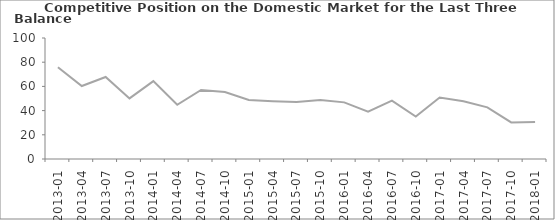
| Category | Balance |
|---|---|
| 2013-01 | 75.9 |
| 2013-04 | 60.3 |
| 2013-07 | 67.8 |
| 2013-10 | 50.1 |
| 2014-01 | 64.4 |
| 2014-04 | 44.8 |
| 2014-07 | 57.1 |
| 2014-10 | 55.4 |
| 2015-01 | 48.8 |
| 2015-04 | 47.8 |
| 2015-07 | 47.1 |
| 2015-10 | 48.8 |
| 2016-01 | 46.8 |
| 2016-04 | 39.1 |
| 2016-07 | 48.3 |
| 2016-10 | 35.1 |
| 2017-01 | 50.8 |
| 2017-04 | 47.7 |
| 2017-07 | 42.7 |
| 2017-10 | 30.2 |
| 2018-01 | 30.6 |